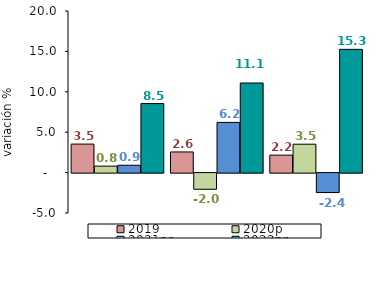
| Category | 2019 | 2020p | 2021pr | 2022pr |
|---|---|---|---|---|
| 0 | 3.529 | 0.799 | 0.909 | 8.541 |
| 1 | 2.556 | -1.998 | 6.21 | 11.087 |
| 2 | 2.162 | 3.516 | -2.407 | 15.254 |